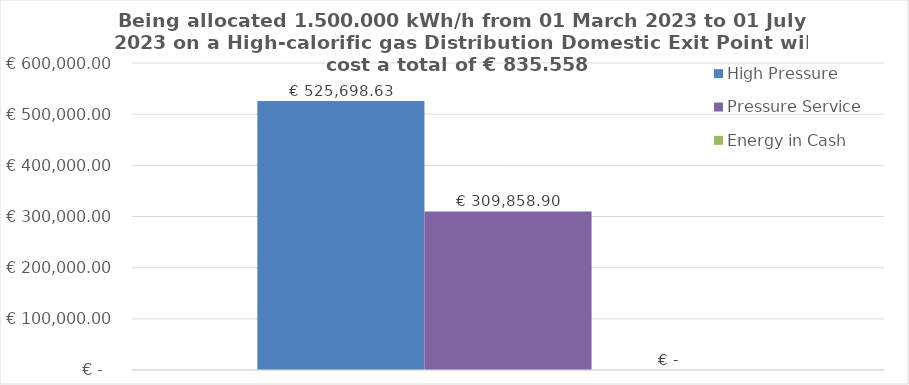
| Category | High Pressure | Pressure Service | Energy in Cash  |
|---|---|---|---|
|  | 525698.63 | 309858.904 | 0 |